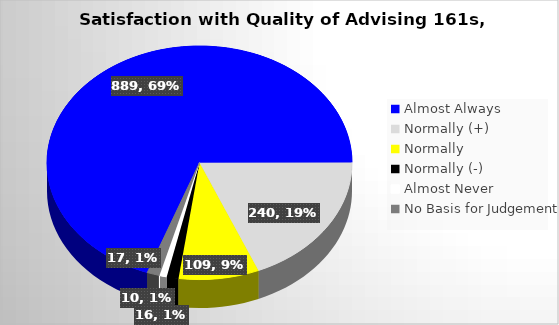
| Category | Series 0 |
|---|---|
| Almost Always | 889 |
| Normally (+) | 240 |
| Normally  | 109 |
| Normally (-) | 16 |
| Almost Never | 10 |
| No Basis for Judgement | 17 |